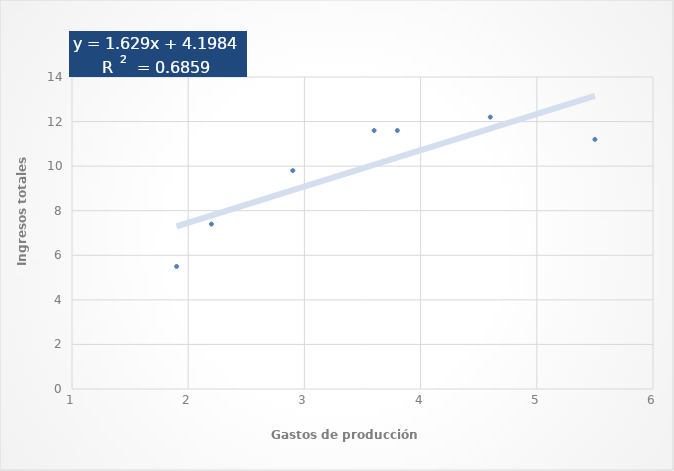
| Category | Y |
|---|---|
| 1.9 | 5.5 |
| 2.2 | 7.4 |
| 2.9 | 9.8 |
| 3.6 | 11.6 |
| 3.8 | 11.6 |
| 4.6 | 12.2 |
| 5.5 | 11.2 |